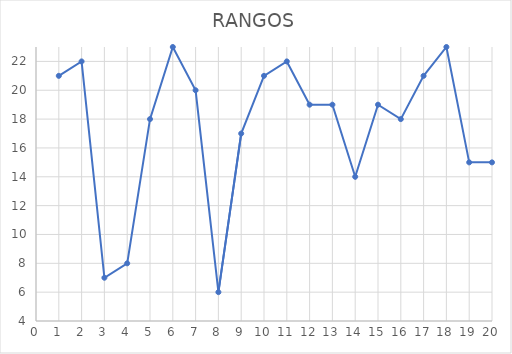
| Category | Series 0 |
|---|---|
| 1.0 | 21 |
| 2.0 | 22 |
| 3.0 | 7 |
| 4.0 | 8 |
| 5.0 | 18 |
| 6.0 | 23 |
| 7.0 | 20 |
| 8.0 | 6 |
| 9.0 | 17 |
| 10.0 | 21 |
| 11.0 | 22 |
| 12.0 | 19 |
| 13.0 | 19 |
| 14.0 | 14 |
| 15.0 | 19 |
| 16.0 | 18 |
| 17.0 | 21 |
| 18.0 | 23 |
| 19.0 | 15 |
| 20.0 | 15 |